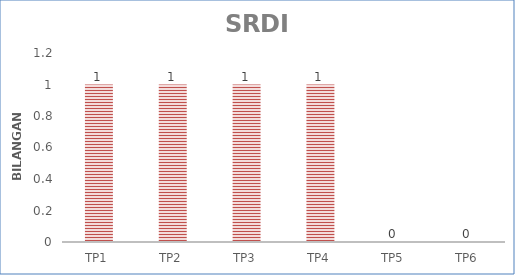
| Category | Series 0 |
|---|---|
| TP1 | 1 |
| TP2 | 1 |
| TP3 | 1 |
| TP4 | 1 |
| TP5 | 0 |
| TP6 | 0 |